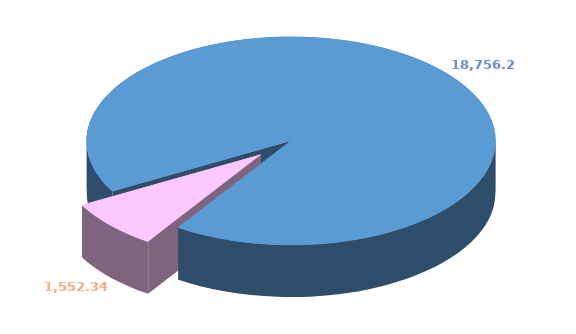
| Category | Series 0 |
|---|---|
| 0 | 18756.283 |
| 1 | 1552.335 |